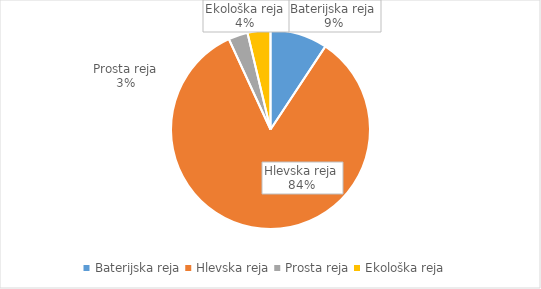
| Category | Količina kosov jajc |
|---|---|
| Baterijska reja | 262944 |
| Hlevska reja | 2373881 |
| Prosta reja | 88988 |
| Ekološka reja | 105490 |